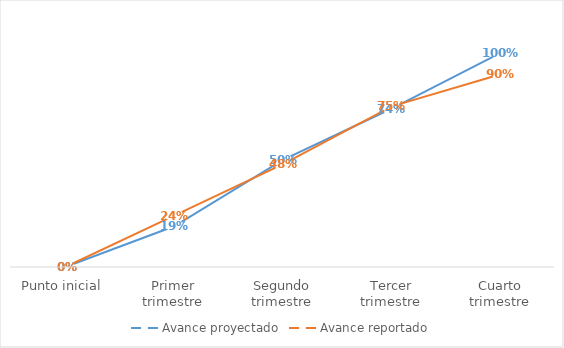
| Category | Avance proyectado | Avance reportado |
|---|---|---|
| Punto inicial | 0 | 0 |
| Primer trimestre | 0.19 | 0.24 |
| Segundo trimestre | 0.5 | 0.48 |
| Tercer trimestre | 0.74 | 0.75 |
| Cuarto trimestre | 1 | 0.9 |